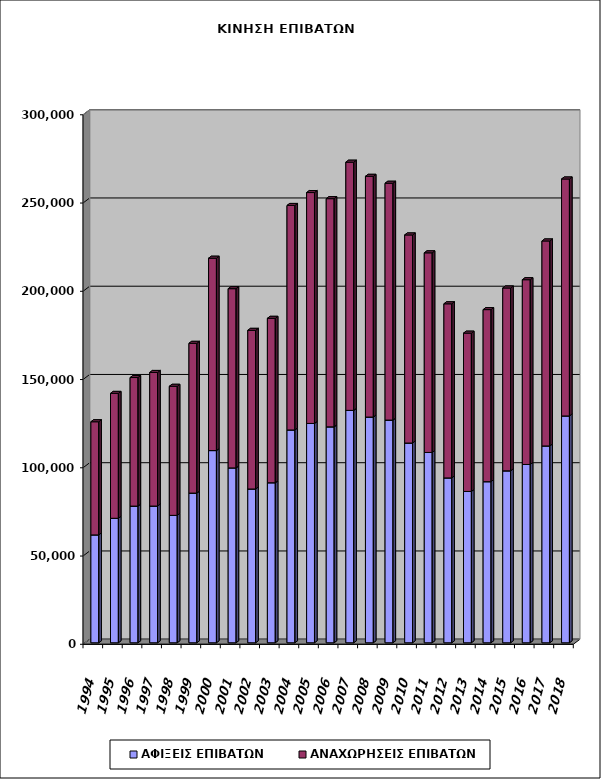
| Category | ΑΦΙΞΕΙΣ ΕΠΙΒΑΤΩΝ | ΑΝΑΧΩΡΗΣΕΙΣ ΕΠΙΒΑΤΩΝ |
|---|---|---|
| 1994.0 | 61128 | 64087 |
| 1995.0 | 70528 | 70755 |
| 1996.0 | 77442 | 72829 |
| 1997.0 | 77465 | 75686 |
| 1998.0 | 72191 | 73121 |
| 1999.0 | 84803 | 84847 |
| 2000.0 | 108894 | 108982 |
| 2001.0 | 99072 | 101542 |
| 2002.0 | 87132 | 89871 |
| 2003.0 | 90670 | 93151 |
| 2004.0 | 120578 | 127180 |
| 2005.0 | 124263 | 130814 |
| 2006.0 | 122334 | 129276 |
| 2007.0 | 131670 | 140601 |
| 2008.0 | 127889 | 136387 |
| 2009.0 | 126171 | 134176 |
| 2010.0 | 113168 | 117889 |
| 2011.0 | 107819 | 113102 |
| 2012.0 | 93412 | 98631 |
| 2013.0 | 85723 | 89699 |
| 2014.0 | 91265 | 97485 |
| 2015.0 | 97411 | 103589 |
| 2016.0 | 101025 | 104670 |
| 2017.0 | 111524 | 116127 |
| 2018.0 | 128516 | 134243 |